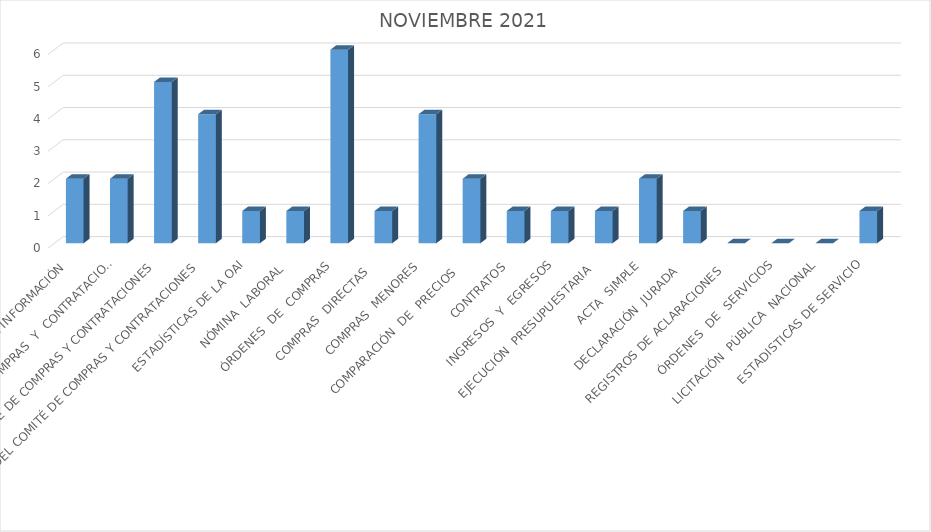
| Category | Series 0 |
|---|---|
| SOLICITUDES DE INFORMACIÓN  | 2 |
| REUNIONES DEL COMITÉ DE COMPRAS  Y  CONTRATACIONES | 2 |
| AGENDAS DEL COMITÉ DE COMPRAS Y CONTRATACIONES | 5 |
| ACTAS DEL COMITÉ DE COMPRAS Y CONTRATACIONES | 4 |
| ESTADÍSTICAS DE LA OAI | 1 |
| NÓMINA  LABORAL  | 1 |
| ÓRDENES  DE  COMPRAS | 6 |
| COMPRAS  DIRECTAS   | 1 |
| COMPRAS  MENORES | 4 |
| COMPARACIÓN  DE  PRECIOS   | 2 |
| CONTRATOS | 1 |
| INGRESOS  Y  EGRESOS | 1 |
| EJECUCIÓN  PRESUPUESTARIA   | 1 |
| ACTA  SIMPLE | 2 |
| DECLARACIÓN  JURADA   | 1 |
| REGISTROS DE ACLARACIONES   | 0 |
| ÓRDENES  DE  SERVICIOS | 0 |
| LICITACIÓN  PÚBLICA  NACIONAL | 0 |
| ESTADISTICAS DE SERVICIO | 1 |